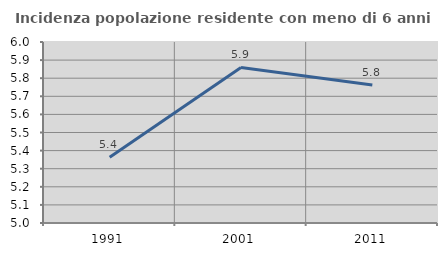
| Category | Incidenza popolazione residente con meno di 6 anni |
|---|---|
| 1991.0 | 5.363 |
| 2001.0 | 5.86 |
| 2011.0 | 5.762 |